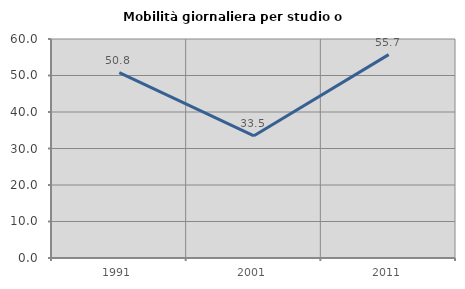
| Category | Mobilità giornaliera per studio o lavoro |
|---|---|
| 1991.0 | 50.767 |
| 2001.0 | 33.471 |
| 2011.0 | 55.718 |